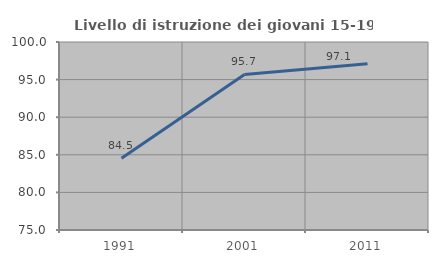
| Category | Livello di istruzione dei giovani 15-19 anni |
|---|---|
| 1991.0 | 84.545 |
| 2001.0 | 95.69 |
| 2011.0 | 97.115 |